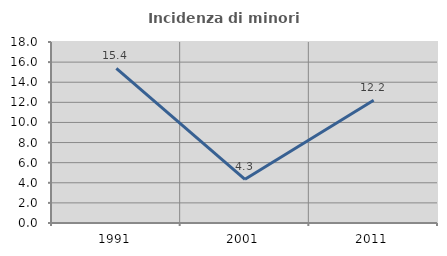
| Category | Incidenza di minori stranieri |
|---|---|
| 1991.0 | 15.385 |
| 2001.0 | 4.348 |
| 2011.0 | 12.209 |